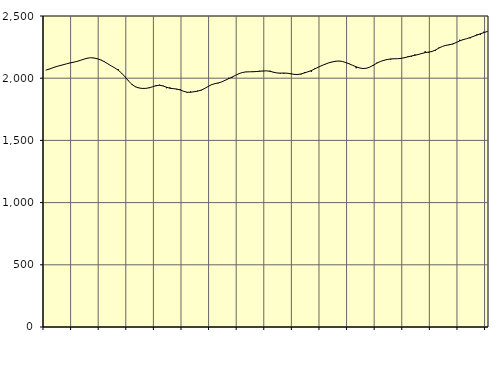
| Category | Piggar | Series 1 |
|---|---|---|
| nan | 2064.3 | 2064.78 |
| 87.0 | 2071.5 | 2073.1 |
| 87.0 | 2081.8 | 2083 |
| 87.0 | 2094.2 | 2092.59 |
| nan | 2102.5 | 2100.34 |
| 88.0 | 2106.4 | 2107.5 |
| 88.0 | 2115.4 | 2115.23 |
| 88.0 | 2123.7 | 2122.23 |
| nan | 2125.8 | 2128.19 |
| 89.0 | 2132.4 | 2134.74 |
| 89.0 | 2144.1 | 2143.06 |
| 89.0 | 2150.8 | 2152.45 |
| nan | 2162.1 | 2160.6 |
| 90.0 | 2164.4 | 2164.49 |
| 90.0 | 2161.6 | 2162.44 |
| 90.0 | 2154.4 | 2155.98 |
| nan | 2147.6 | 2146.3 |
| 91.0 | 2135.9 | 2132.57 |
| 91.0 | 2116.9 | 2115.5 |
| 91.0 | 2098.9 | 2098.54 |
| nan | 2081.7 | 2083.09 |
| 92.0 | 2072.7 | 2065.15 |
| 92.0 | 2038.4 | 2041.03 |
| 92.0 | 2012.4 | 2010.73 |
| nan | 1980.1 | 1978.08 |
| 93.0 | 1945.1 | 1949.94 |
| 93.0 | 1933.8 | 1930.96 |
| 93.0 | 1923.7 | 1921.59 |
| nan | 1915.2 | 1917.77 |
| 94.0 | 1918.5 | 1918.19 |
| 94.0 | 1920.7 | 1923.23 |
| 94.0 | 1931.4 | 1931.52 |
| nan | 1936.2 | 1940.31 |
| 95.0 | 1947.3 | 1943.38 |
| 95.0 | 1939.7 | 1937.77 |
| 95.0 | 1919.2 | 1927.63 |
| nan | 1925.8 | 1919.27 |
| 96.0 | 1914.3 | 1915.89 |
| 96.0 | 1908.7 | 1912.99 |
| 96.0 | 1911.4 | 1905.23 |
| nan | 1893.8 | 1894.56 |
| 97.0 | 1883.3 | 1886.83 |
| 97.0 | 1893.3 | 1887.03 |
| 97.0 | 1891.8 | 1891.23 |
| nan | 1899.6 | 1895.78 |
| 98.0 | 1898.9 | 1903.56 |
| 98.0 | 1920.5 | 1916.37 |
| 98.0 | 1931.3 | 1932.26 |
| nan | 1945.7 | 1947.08 |
| 99.0 | 1958 | 1955.97 |
| 99.0 | 1958.6 | 1961.88 |
| 99.0 | 1970.8 | 1970.31 |
| nan | 1981.7 | 1982.82 |
| 0.0 | 2002.9 | 1995.95 |
| 0.0 | 2003.7 | 2008.91 |
| 0.0 | 2023 | 2022.83 |
| nan | 2037.6 | 2036.16 |
| 1.0 | 2044.1 | 2045.68 |
| 1.0 | 2051.8 | 2050.3 |
| 1.0 | 2051.5 | 2051.45 |
| nan | 2055.7 | 2051.73 |
| 2.0 | 2050.5 | 2053.39 |
| 2.0 | 2059.8 | 2055.71 |
| 2.0 | 2056.1 | 2058.24 |
| nan | 2058.4 | 2058.89 |
| 3.0 | 2060.1 | 2055.67 |
| 3.0 | 2045.9 | 2048.55 |
| 3.0 | 2042.8 | 2041.95 |
| nan | 2036.5 | 2040.7 |
| 4.0 | 2035.4 | 2041.48 |
| 4.0 | 2041.7 | 2040.15 |
| 4.0 | 2033.2 | 2036.1 |
| nan | 2032.1 | 2030.87 |
| 5.0 | 2033.6 | 2029.25 |
| 5.0 | 2030.1 | 2034.21 |
| 5.0 | 2047.9 | 2042.55 |
| nan | 2052.5 | 2051.34 |
| 6.0 | 2051.1 | 2061.63 |
| 6.0 | 2079.3 | 2074.76 |
| 6.0 | 2087.5 | 2088.71 |
| nan | 2098.6 | 2100.88 |
| 7.0 | 2110.6 | 2112.73 |
| 7.0 | 2123.9 | 2122.91 |
| 7.0 | 2131 | 2130.47 |
| nan | 2133.7 | 2136.16 |
| 8.0 | 2137.2 | 2138.22 |
| 8.0 | 2134.8 | 2134.6 |
| 8.0 | 2123.2 | 2125.67 |
| nan | 2117.4 | 2115.01 |
| 9.0 | 2102.9 | 2103.18 |
| 9.0 | 2079.7 | 2091.5 |
| 9.0 | 2083.3 | 2082.04 |
| nan | 2075.6 | 2077.82 |
| 10.0 | 2081.9 | 2080.3 |
| 10.0 | 2090 | 2089.99 |
| 10.0 | 2100.2 | 2105.23 |
| nan | 2125.3 | 2121.22 |
| 11.0 | 2135 | 2134.11 |
| 11.0 | 2139.7 | 2143.43 |
| 11.0 | 2154 | 2150.25 |
| nan | 2149.7 | 2154.74 |
| 12.0 | 2155.2 | 2156.2 |
| 12.0 | 2156.6 | 2156.65 |
| 12.0 | 2156.9 | 2159.46 |
| nan | 2161.9 | 2164.63 |
| 13.0 | 2176 | 2171.78 |
| 13.0 | 2172.1 | 2178.64 |
| 13.0 | 2191.5 | 2183.93 |
| nan | 2186.8 | 2190.61 |
| 14.0 | 2195 | 2198.66 |
| 14.0 | 2217.2 | 2205.62 |
| 14.0 | 2204.5 | 2209.76 |
| nan | 2213.7 | 2214.9 |
| 15.0 | 2221.7 | 2226.82 |
| 15.0 | 2246.6 | 2242.54 |
| 15.0 | 2256.1 | 2255.61 |
| nan | 2263 | 2264.04 |
| 16.0 | 2273.1 | 2268.7 |
| 16.0 | 2272.1 | 2275.63 |
| 16.0 | 2286.7 | 2286.81 |
| nan | 2309.3 | 2299.57 |
| 17.0 | 2306.8 | 2310.04 |
| 17.0 | 2317 | 2317.35 |
| 17.0 | 2320.3 | 2326.18 |
| nan | 2334 | 2336.36 |
| 18.0 | 2352.8 | 2346.49 |
| 18.0 | 2348 | 2357.03 |
| 18.0 | 2373.9 | 2366.57 |
| nan | 2371.9 | 2375.39 |